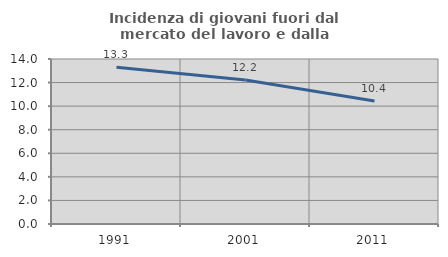
| Category | Incidenza di giovani fuori dal mercato del lavoro e dalla formazione  |
|---|---|
| 1991.0 | 13.298 |
| 2001.0 | 12.222 |
| 2011.0 | 10.429 |